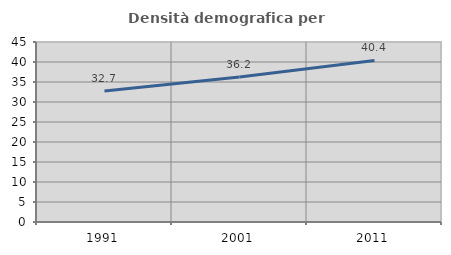
| Category | Densità demografica |
|---|---|
| 1991.0 | 32.726 |
| 2001.0 | 36.249 |
| 2011.0 | 40.397 |